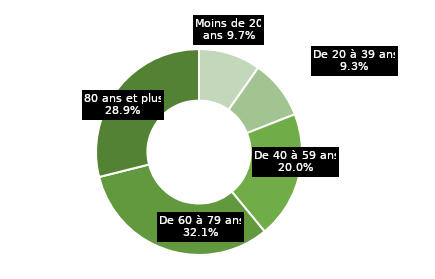
| Category | Tranches âge |
|---|---|
| Moins de 20 ans | 0.097 |
| De 20 à 39 ans | 0.093 |
| De 40 à 59 ans | 0.2 |
| De 60 à 79 ans | 0.321 |
| 80 ans et plus | 0.289 |